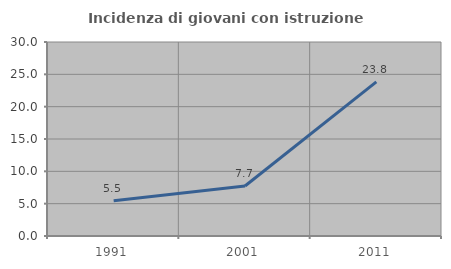
| Category | Incidenza di giovani con istruzione universitaria |
|---|---|
| 1991.0 | 5.455 |
| 2001.0 | 7.732 |
| 2011.0 | 23.841 |